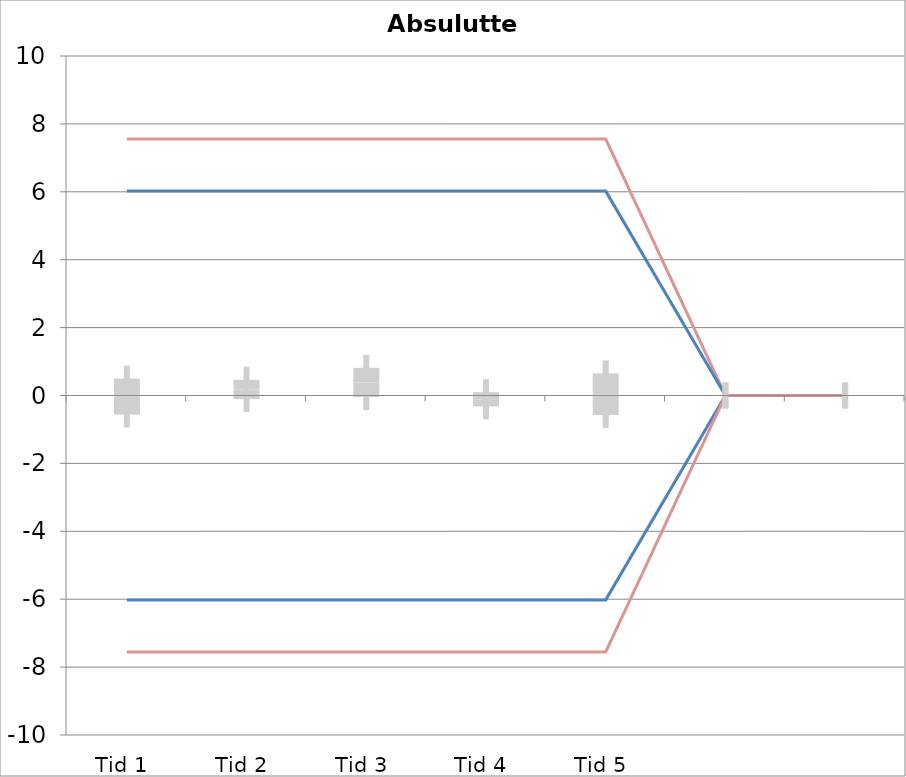
| Category | 1 | 2 | 3 | 4 | 5 | 6 | 7 | 8 | 9 | 10 | 11 | 12 | 13 | 14 | 15 | 16 | 17 | 18 | 19 | 20 | TEa | B | -B | -TEa | M |
|---|---|---|---|---|---|---|---|---|---|---|---|---|---|---|---|---|---|---|---|---|---|---|---|---|---|
| Tid 1 | 0.3 | 0.4 | -0.3 | 0.5 | -0.4 | -0.5 | 0.2 | -0.2 | -0.3 | -0.2 | -0.3 | -0.4 | 0.2 | 0.3 | 0.6 | 0.3 | 3.4 | -1.1 | -3.1 | 0 | 7.554 | 6.02 | -6.02 | -7.554 | -0.032 |
| Tid 2 | 0.7 | 0.9 | -0.1 | 0.7 | -0.3 | -0.2 | -0.2 | 0.4 | 0 | 0.4 | 0 | 0.3 | 0.6 | 0.2 | 0.3 | -0.1 | -1.1 | -0.8 | 1.7 | 0 | 7.554 | 6.02 | -6.02 | -7.554 | 0.179 |
| Tid 3 | 0.5 | 0.5 | -0.4 | 0.4 | -0.6 | -0.3 | 0.2 | 0.2 | 0 | 0.2 | 0 | 0.7 | 0 | 0 | 0.4 | 1 | 0.8 | -0.2 | 3.9 | 0 | 7.554 | 6.02 | -6.02 | -7.554 | 0.384 |
| Tid 4 | 0.3 | 0.4 | -0.2 | 0.5 | -0.5 | -0.4 | -0.1 | -0.6 | -0.5 | -0.6 | -0.5 | -0.9 | 0 | -0.2 | 0.5 | -0.1 | 0.5 | 0.6 | -0.3 | 0 | 7.554 | 6.02 | -6.02 | -7.554 | -0.111 |
| Tid 5 | 0 | 0.3 | -0.4 | 0.4 | 0 | 0 | 0.2 | -0.6 | -0.6 | -0.6 | -0.6 | -1.1 | 0.3 | 0.2 | 0.5 | 1.7 | 3.1 | 0.4 | -2.6 | 0 | 7.554 | 6.02 | -6.02 | -7.554 | 0.037 |